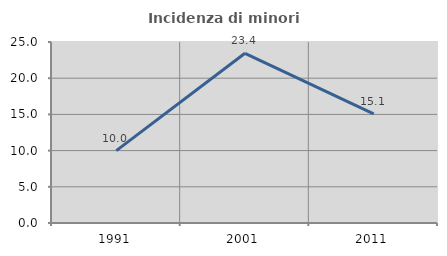
| Category | Incidenza di minori stranieri |
|---|---|
| 1991.0 | 10 |
| 2001.0 | 23.438 |
| 2011.0 | 15.068 |